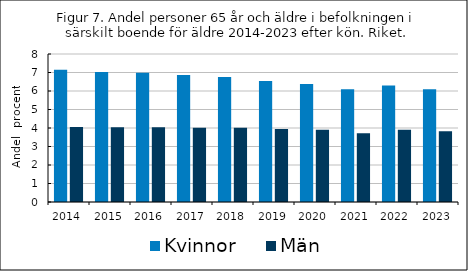
| Category | Kvinnor    | Män   |
|---|---|---|
| 2014.0 | 7.151 | 4.051 |
| 2015.0 | 7.022 | 4.043 |
| 2016.0 | 6.983 | 4.034 |
| 2017.0 | 6.863 | 4.018 |
| 2018.0 | 6.752 | 4.017 |
| 2019.0 | 6.539 | 3.948 |
| 2020.0 | 6.376 | 3.9 |
| 2021.0 | 6.101 | 3.717 |
| 2022.0 | 6.293 | 3.908 |
| 2023.0 | 6.1 | 3.822 |